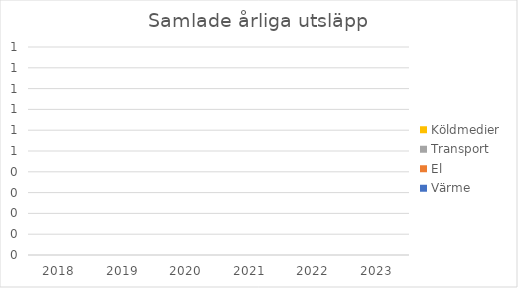
| Category | Värme | El | Transport | Köldmedier |
|---|---|---|---|---|
| 2018.0 | 0 | 0 | 0 | 0 |
| 2019.0 | 0 | 0 | 0 | 0 |
| 2020.0 | 0 | 0 | 0 | 0 |
| 2021.0 | 0 | 0 | 0 | 0 |
| 2022.0 | 0 | 0 | 0 | 0 |
| 2023.0 | 0 | 0 | 0 | 0 |